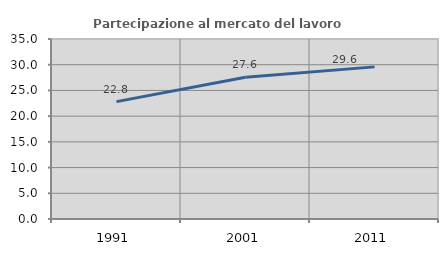
| Category | Partecipazione al mercato del lavoro  femminile |
|---|---|
| 1991.0 | 22.823 |
| 2001.0 | 27.553 |
| 2011.0 | 29.58 |